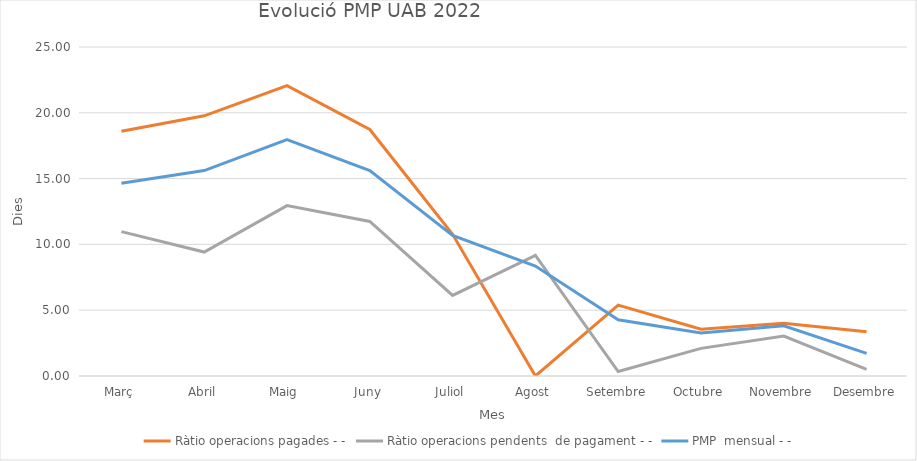
| Category | Ràtio operacions pagades | Ràtio operacions pendents  de pagament | PMP  mensual |
|---|---|---|---|
| Març | 18.6 | 10.97 | 14.64 |
| Abril | 19.77 | 9.42 | 15.61 |
| Maig | 22.07 | 12.95 | 17.96 |
| Juny | 18.73 | 11.74 | 15.61 |
| Juliol | 10.77 | 6.12 | 10.68 |
| Agost | 0 | 9.17 | 8.35 |
| Setembre | 5.39 | 0.34 | 4.27 |
| Octubre | 3.55 | 2.1 | 3.26 |
| Novembre | 4 | 3.03 | 3.82 |
| Desembre | 3.36 | 0.5 | 1.72 |